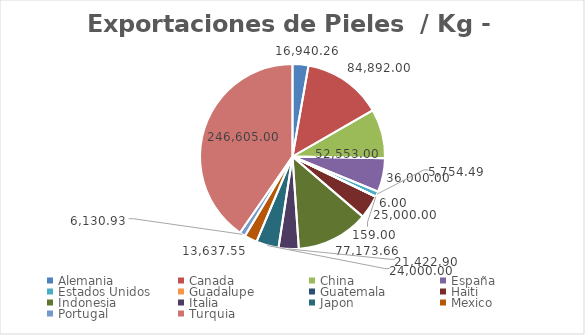
| Category | kg | Valor US  |
|---|---|---|
| Alemania | 16940.26 | 317498.156 |
| Canada | 84892 | 37740.011 |
| China | 52553 | 55051.852 |
| España | 36000 | 36000 |
| Estados Unidos | 5754.49 | 76572.17 |
| Guadalupe | 6 | 107.47 |
| Guatemala | 159 | 3026.52 |
| Haiti | 25000 | 21134 |
| Indonesia | 77173.66 | 86204.668 |
| Italia | 21422.9 | 223452.242 |
| Japon | 24000 | 15600 |
| Mexico | 13637.55 | 214890.594 |
| Portugal | 6130.93 | 125357.657 |
| Turquia | 246605 | 36413 |